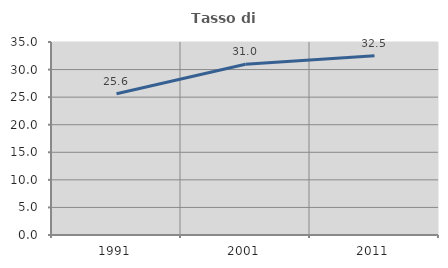
| Category | Tasso di occupazione   |
|---|---|
| 1991.0 | 25.6 |
| 2001.0 | 30.975 |
| 2011.0 | 32.488 |